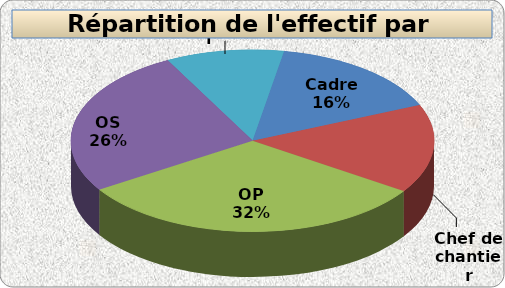
| Category | Nombre |
|---|---|
| Cadre | 3 |
| Chef de chantier | 3 |
| OP | 6 |
| OS | 5 |
| Apprenti | 2 |